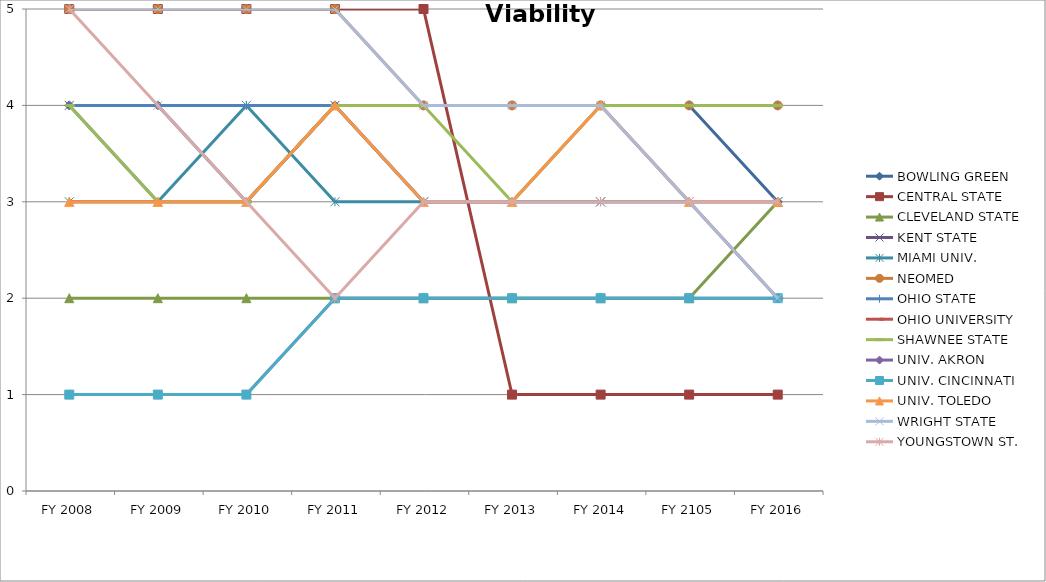
| Category | BOWLING GREEN  | CENTRAL STATE  | CLEVELAND STATE  | KENT STATE  | MIAMI UNIV.  | NEOMED  | OHIO STATE  | OHIO UNIVERSITY  | SHAWNEE STATE  | UNIV. AKRON  | UNIV. CINCINNATI  | UNIV. TOLEDO  | WRIGHT STATE  | YOUNGSTOWN ST.  |
|---|---|---|---|---|---|---|---|---|---|---|---|---|---|---|
| FY 2016 | 3 | 1 | 3 | 3 | 3 | 4 | 4 | 2 | 4 | 2 | 2 | 3 | 2 | 3 |
| FY 2105 | 4 | 1 | 2 | 3 | 3 | 4 | 4 | 3 | 4 | 2 | 2 | 3 | 3 | 3 |
| FY 2014 | 4 | 1 | 2 | 3 | 3 | 4 | 4 | 4 | 4 | 2 | 2 | 4 | 4 | 3 |
| FY 2013 | 4 | 1 | 2 | 3 | 3 | 4 | 3 | 4 | 3 | 2 | 2 | 3 | 4 | 3 |
| FY 2012 | 4 | 5 | 2 | 3 | 3 | 4 | 3 | 4 | 4 | 2 | 2 | 3 | 4 | 3 |
| FY 2011 | 4 | 5 | 2 | 4 | 3 | 5 | 4 | 4 | 4 | 2 | 2 | 4 | 5 | 2 |
| FY 2010 | 3 | 5 | 2 | 3 | 4 | 5 | 4 | 3 | 3 | 1 | 1 | 3 | 5 | 3 |
| FY 2009 | 4 | 5 | 2 | 3 | 3 | 5 | 4 | 3 | 3 | 1 | 1 | 3 | 5 | 4 |
| FY 2008 | 4 | 5 | 2 | 4 | 3 | 5 | 4 | 3 | 4 | 1 | 1 | 3 | 5 | 5 |